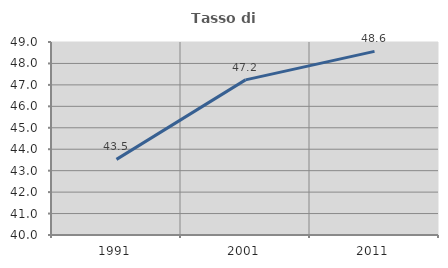
| Category | Tasso di occupazione   |
|---|---|
| 1991.0 | 43.526 |
| 2001.0 | 47.234 |
| 2011.0 | 48.564 |